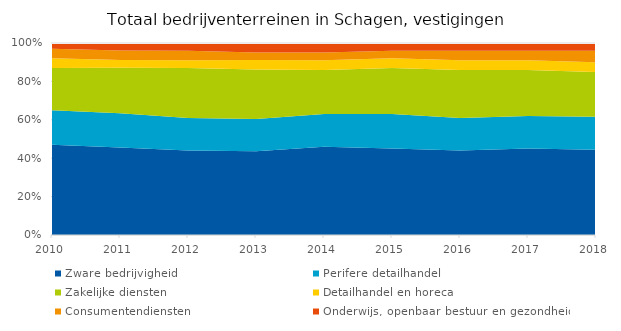
| Category | Zware bedrijvigheid | Perifere detailhandel | Zakelijke diensten | Detailhandel en horeca | Consumentendiensten | Onderwijs, openbaar bestuur en gezondheid |
|---|---|---|---|---|---|---|
| 2010 | 0.47 | 0.18 | 0.22 | 0.05 | 0.05 | 0.03 |
| 2011 | 0.46 | 0.18 | 0.24 | 0.04 | 0.05 | 0.04 |
| 2012 | 0.44 | 0.17 | 0.26 | 0.04 | 0.05 | 0.04 |
| 2013 | 0.44 | 0.17 | 0.26 | 0.05 | 0.04 | 0.05 |
| 2014 | 0.46 | 0.17 | 0.23 | 0.05 | 0.04 | 0.05 |
| 2015 | 0.45 | 0.18 | 0.24 | 0.05 | 0.04 | 0.04 |
| 2016 | 0.44 | 0.17 | 0.25 | 0.05 | 0.05 | 0.04 |
| 2017 | 0.45 | 0.17 | 0.24 | 0.05 | 0.05 | 0.04 |
| 2018 | 0.44 | 0.17 | 0.23 | 0.05 | 0.06 | 0.04 |